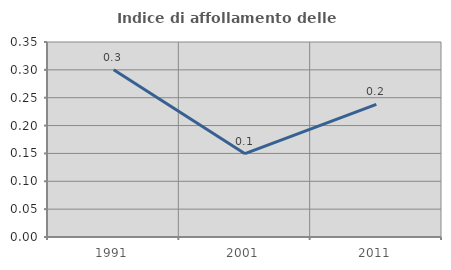
| Category | Indice di affollamento delle abitazioni  |
|---|---|
| 1991.0 | 0.3 |
| 2001.0 | 0.149 |
| 2011.0 | 0.238 |